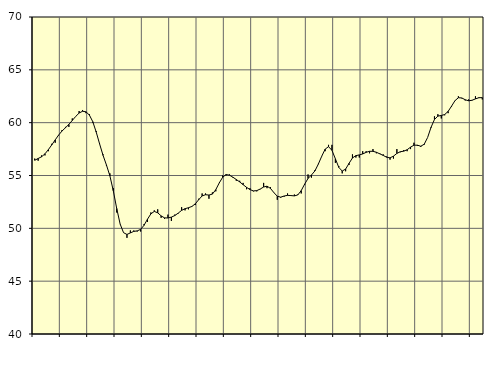
| Category | Piggar | Samtliga fast anställda (inkl. fast anställda utomlands) |
|---|---|---|
| nan | 56.6 | 56.44 |
| 87.0 | 56.4 | 56.61 |
| 87.0 | 56.9 | 56.77 |
| 87.0 | 56.9 | 57.05 |
| nan | 57.3 | 57.45 |
| 88.0 | 58 | 57.9 |
| 88.0 | 58.1 | 58.37 |
| 88.0 | 58.8 | 58.83 |
| nan | 59.3 | 59.21 |
| 89.0 | 59.6 | 59.52 |
| 89.0 | 59.6 | 59.84 |
| 89.0 | 60.4 | 60.21 |
| nan | 60.6 | 60.59 |
| 90.0 | 61.1 | 60.91 |
| 90.0 | 61.2 | 61.08 |
| 90.0 | 60.9 | 61.03 |
| nan | 60.8 | 60.72 |
| 91.0 | 60 | 60.09 |
| 91.0 | 59.2 | 59.11 |
| 91.0 | 58 | 57.98 |
| nan | 57 | 56.91 |
| 92.0 | 55.9 | 55.99 |
| 92.0 | 55.2 | 54.97 |
| 92.0 | 53.8 | 53.56 |
| nan | 51.5 | 51.88 |
| 93.0 | 50.4 | 50.41 |
| 93.0 | 49.6 | 49.59 |
| 93.0 | 49.1 | 49.42 |
| nan | 49.8 | 49.57 |
| 94.0 | 49.8 | 49.71 |
| 94.0 | 49.7 | 49.76 |
| 94.0 | 49.7 | 49.9 |
| nan | 50.4 | 50.29 |
| 95.0 | 50.6 | 50.86 |
| 95.0 | 51.5 | 51.37 |
| 95.0 | 51.7 | 51.6 |
| nan | 51.8 | 51.47 |
| 96.0 | 51 | 51.18 |
| 96.0 | 50.9 | 50.99 |
| 96.0 | 51.3 | 50.98 |
| nan | 50.7 | 51.06 |
| 97.0 | 51.3 | 51.21 |
| 97.0 | 51.4 | 51.44 |
| 97.0 | 52 | 51.7 |
| nan | 51.7 | 51.86 |
| 98.0 | 51.8 | 51.95 |
| 98.0 | 52.1 | 52.07 |
| 98.0 | 52.2 | 52.32 |
| nan | 52.8 | 52.71 |
| 99.0 | 53.3 | 53.07 |
| 99.0 | 53.3 | 53.18 |
| 99.0 | 52.8 | 53.15 |
| nan | 53.4 | 53.24 |
| 0.0 | 53.5 | 53.66 |
| 0.0 | 54.3 | 54.29 |
| 0.0 | 55 | 54.83 |
| nan | 55 | 55.09 |
| 1.0 | 55.1 | 55.03 |
| 1.0 | 54.8 | 54.84 |
| 1.0 | 54.5 | 54.62 |
| nan | 54.5 | 54.39 |
| 2.0 | 54.3 | 54.13 |
| 2.0 | 53.7 | 53.88 |
| 2.0 | 53.8 | 53.67 |
| nan | 53.5 | 53.54 |
| 3.0 | 53.5 | 53.57 |
| 3.0 | 53.7 | 53.72 |
| 3.0 | 54.3 | 53.91 |
| nan | 53.8 | 53.99 |
| 4.0 | 53.9 | 53.78 |
| 4.0 | 53.4 | 53.38 |
| 4.0 | 52.7 | 53.04 |
| nan | 52.9 | 52.95 |
| 5.0 | 53 | 53.06 |
| 5.0 | 53.3 | 53.12 |
| 5.0 | 53.1 | 53.1 |
| nan | 53.2 | 53.07 |
| 6.0 | 53.2 | 53.16 |
| 6.0 | 53.3 | 53.57 |
| 6.0 | 54.1 | 54.18 |
| nan | 55.1 | 54.72 |
| 7.0 | 54.8 | 55.05 |
| 7.0 | 55.5 | 55.43 |
| 7.0 | 56.1 | 56.07 |
| nan | 56.8 | 56.82 |
| 8.0 | 57.3 | 57.49 |
| 8.0 | 57.9 | 57.73 |
| 8.0 | 57.9 | 57.38 |
| nan | 56.2 | 56.58 |
| 9.0 | 55.9 | 55.77 |
| 9.0 | 55.2 | 55.42 |
| 9.0 | 55.4 | 55.61 |
| nan | 56 | 56.15 |
| 10.0 | 57 | 56.66 |
| 10.0 | 56.7 | 56.88 |
| 10.0 | 56.7 | 56.95 |
| nan | 57.3 | 57.04 |
| 11.0 | 57.3 | 57.19 |
| 11.0 | 57.1 | 57.29 |
| 11.0 | 57.5 | 57.29 |
| nan | 57.1 | 57.2 |
| 12.0 | 57.1 | 57.05 |
| 12.0 | 57 | 56.9 |
| 12.0 | 56.8 | 56.73 |
| nan | 56.5 | 56.67 |
| 13.0 | 56.6 | 56.83 |
| 13.0 | 57.5 | 57.09 |
| 13.0 | 57.2 | 57.25 |
| nan | 57.4 | 57.3 |
| 14.0 | 57.3 | 57.44 |
| 14.0 | 57.5 | 57.68 |
| 14.0 | 58.1 | 57.87 |
| nan | 57.8 | 57.87 |
| 15.0 | 57.7 | 57.77 |
| 15.0 | 57.9 | 57.96 |
| 15.0 | 58.6 | 58.6 |
| nan | 59.5 | 59.56 |
| 16.0 | 60.6 | 60.3 |
| 16.0 | 60.8 | 60.62 |
| 16.0 | 60.4 | 60.68 |
| nan | 60.7 | 60.77 |
| 17.0 | 60.9 | 61.07 |
| 17.0 | 61.5 | 61.56 |
| 17.0 | 62.1 | 62.08 |
| nan | 62.5 | 62.36 |
| 18.0 | 62.3 | 62.34 |
| 18.0 | 62.1 | 62.17 |
| 18.0 | 62.2 | 62.07 |
| nan | 62.1 | 62.12 |
| 19.0 | 62.5 | 62.25 |
| 19.0 | 62.4 | 62.36 |
| 19.0 | 62.2 | 62.37 |